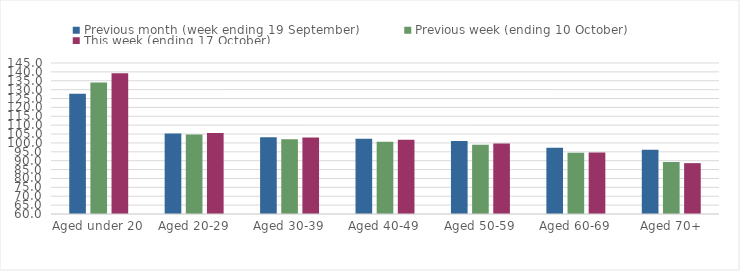
| Category | Previous month (week ending 19 September) | Previous week (ending 10 October) | This week (ending 17 October) |
|---|---|---|---|
| Aged under 20 | 127.74 | 134.01 | 139.16 |
| Aged 20-29 | 105.34 | 104.69 | 105.57 |
| Aged 30-39 | 103.26 | 102.09 | 103.02 |
| Aged 40-49 | 102.29 | 100.73 | 101.8 |
| Aged 50-59 | 101.04 | 99 | 99.72 |
| Aged 60-69 | 97.26 | 94.53 | 94.57 |
| Aged 70+ | 96.21 | 89.31 | 88.63 |